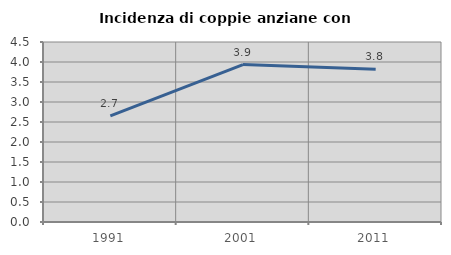
| Category | Incidenza di coppie anziane con figli |
|---|---|
| 1991.0 | 2.654 |
| 2001.0 | 3.937 |
| 2011.0 | 3.821 |